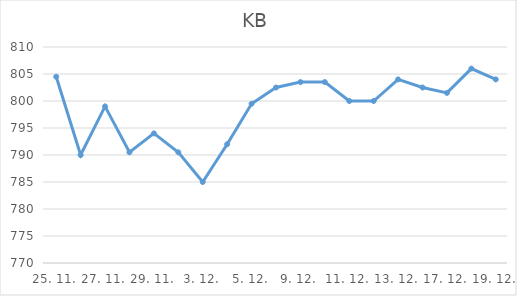
| Category | KB |
|---|---|
| 25. 11. | 804.5 |
| 26. 11. | 790 |
| 27. 11. | 799 |
| 28. 11. | 790.5 |
| 29. 11. | 794 |
| 2. 12. | 790.5 |
| 3. 12. | 785 |
| 4. 12. | 792 |
| 5. 12. | 799.5 |
| 6. 12. | 802.5 |
| 9. 12. | 803.5 |
| 10. 12. | 803.5 |
| 11. 12. | 800 |
| 12. 12. | 800 |
| 13. 12. | 804 |
| 16. 12. | 802.5 |
| 17. 12. | 801.5 |
| 18. 12. | 806 |
| 19. 12. | 804 |